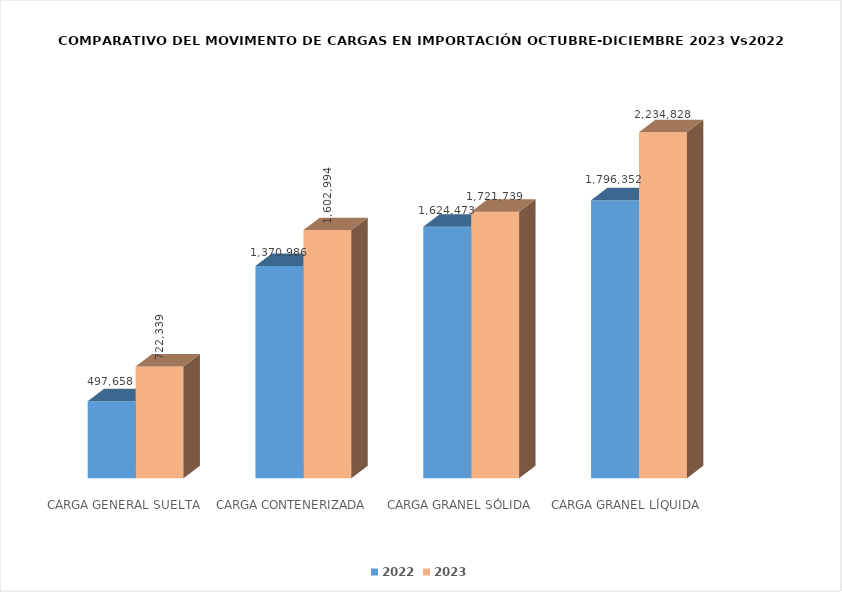
| Category | 2022 | 2023 |
|---|---|---|
|  CARGA GENERAL SUELTA | 497658 | 722338.8 |
|  CARGA CONTENERIZADA | 1370986 | 1602993.99 |
|  CARGA GRANEL SÓLIDA | 1624473 | 1721739 |
| CARGA GRANEL LÍQUIDA | 1796352 | 2234828 |